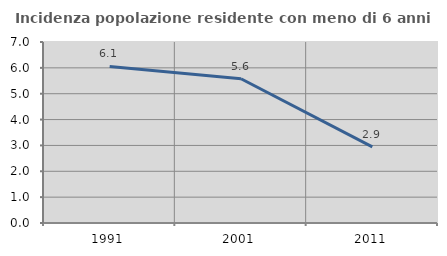
| Category | Incidenza popolazione residente con meno di 6 anni |
|---|---|
| 1991.0 | 6.056 |
| 2001.0 | 5.577 |
| 2011.0 | 2.943 |